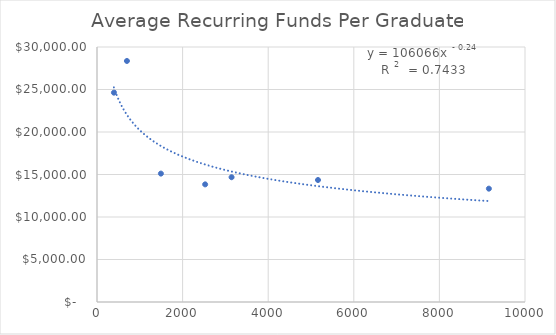
| Category | Average Recurring Funds Per Graduate |
|---|---|
| 395.3333333333333 | 24628.628 |
| 699.3333333333334 | 28356.897 |
| 1493.0 | 15105.969 |
| 2527.0 | 13839.354 |
| 3144.5 | 14679.697 |
| 5163.25 | 14351.845 |
| 9156.0 | 13333.8 |